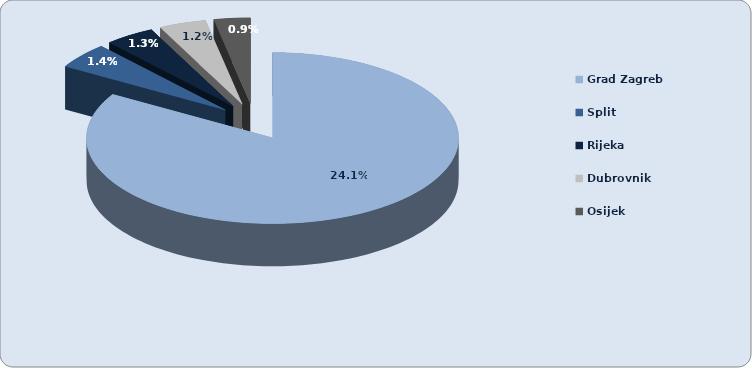
| Category | Series 0 |
|---|---|
| Grad Zagreb | 0.241 |
| Split | 0.014 |
| Rijeka | 0.013 |
| Dubrovnik | 0.012 |
| Osijek | 0.009 |